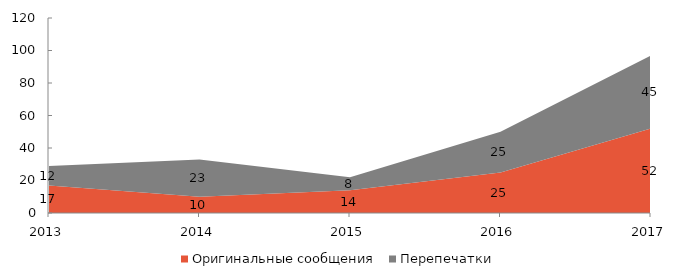
| Category | Оригинальные сообщения | Перепечатки |
|---|---|---|
| 2013 | 17 | 12 |
| 2014 | 10 | 23 |
| 2015 | 14 | 8 |
| 2016 | 25 | 25 |
| 2017 | 52 | 45 |